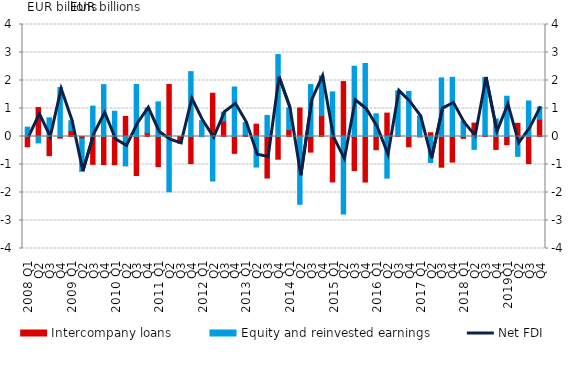
| Category | Intercompany loans | Equity and reinvested earnings |
|---|---|---|
| 2008 Q1 | -0.368 | 0.334 |
| Q2 | 1.034 | -0.231 |
| Q3 | -0.685 | 0.667 |
| Q4 | -0.056 | 1.75 |
| 2009 Q1 | 0.204 | 0.359 |
| Q2 | -0.082 | -1.163 |
| Q3 | -0.994 | 1.084 |
| Q4 | -1.003 | 1.852 |
| 2010 Q1 | -1.006 | 0.9 |
| Q2 | 0.714 | -1.049 |
| Q3 | -1.395 | 1.858 |
| Q4 | 0.13 | 0.893 |
| 2011 Q1 | -1.076 | 1.238 |
| Q2 | 1.858 | -1.975 |
| Q3 | -0.199 | -0.045 |
| Q4 | -0.968 | 2.317 |
| 2012 Q1 | -0.004 | 0.564 |
| Q2 | 1.547 | -1.589 |
| Q3 | 0.553 | 0.32 |
| Q4 | -0.601 | 1.767 |
| 2013 Q1 | 0.068 | 0.429 |
| Q2 | 0.44 | -1.091 |
| Q3 | -1.483 | 0.753 |
| Q4 | -0.811 | 2.927 |
| 2014 Q1 | 0.246 | 0.777 |
| Q2 | 1.019 | -2.421 |
| Q3 | -0.558 | 1.854 |
| Q4 | 0.746 | 1.416 |
| 2015 Q1 | -1.622 | 1.593 |
| Q2 | 1.963 | -2.769 |
| Q3 | -1.215 | 2.509 |
| Q4 | -1.626 | 2.607 |
| 2016 Q1 | -0.471 | 0.811 |
| Q2 | 0.835 | -1.486 |
| Q3 | 0.022 | 1.608 |
| Q4 | -0.367 | 1.611 |
| 2017 Q1 | -0.014 | 0.732 |
| Q2 | 0.134 | -0.928 |
| Q3 | -1.096 | 2.094 |
| Q4 | -0.914 | 2.113 |
| 2018 Q1 | -0.066 | 0.549 |
| Q2 | 0.479 | -0.458 |
| Q3 | 0.048 | 2.061 |
| Q4 | -0.461 | 0.63 |
| 2019Q1 | -0.292 | 1.44 |
| Q2 | 0.472 | -0.709 |
| Q3 | -0.968 | 1.269 |
| Q4 | 0.614 | 0.442 |